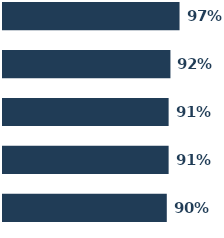
| Category | Series 0 | Series 1 | Series 2 | Series 3 | Series 4 |
|---|---|---|---|---|---|
| 0 | 0.97 | 0.92 | 0.91 | 0.91 | 0.9 |